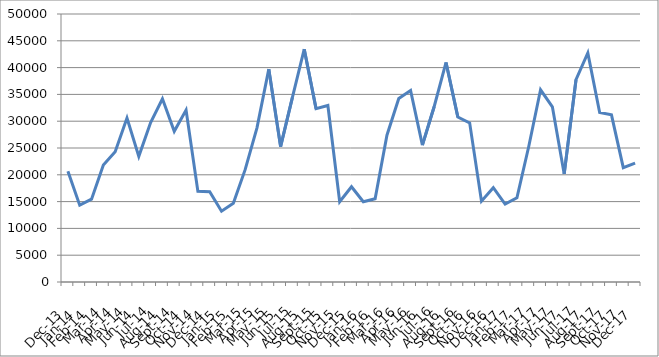
| Category | Mes del Año |
|---|---|
| 2013-12-01 | 20678 |
| 2014-01-01 | 14335 |
| 2014-02-01 | 15455 |
| 2014-03-01 | 21841 |
| 2014-04-01 | 24300 |
| 2014-05-01 | 30608 |
| 2014-06-01 | 23439 |
| 2014-07-01 | 29747 |
| 2014-08-01 | 34195 |
| 2014-09-01 | 28107 |
| 2014-10-01 | 32080 |
| 2014-11-01 | 16911 |
| 2014-12-01 | 16842 |
| 2015-01-01 | 13216 |
| 2015-02-01 | 14678 |
| 2015-03-01 | 20964 |
| 2015-04-01 | 28764 |
| 2015-05-01 | 39712 |
| 2015-06-01 | 25254 |
| 2015-07-01 | 34430 |
| 2015-08-01 | 43428 |
| 2015-09-01 | 32352 |
| 2015-10-01 | 32938 |
| 2015-11-01 | 14992 |
| 2015-12-01 | 17779 |
| 2016-01-01 | 14974 |
| 2016-02-01 | 15526 |
| 2016-03-01 | 27389 |
| 2016-04-01 | 34231 |
| 2016-05-01 | 35728 |
| 2016-06-01 | 25531 |
| 2016-07-01 | 32747 |
| 2016-08-01 | 40962 |
| 2016-09-01 | 30770 |
| 2016-10-01 | 29684 |
| 2016-11-01 | 15081 |
| 2016-12-01 | 17590 |
| 2017-01-01 | 14545 |
| 2017-02-01 | 15699 |
| 2017-03-01 | 25285 |
| 2017-04-01 | 35858 |
| 2017-05-01 | 32692 |
| 2017-06-01 | 20164 |
| 2017-07-01 | 37735 |
| 2017-08-01 | 42726 |
| 2017-09-01 | 31628 |
| 2017-10-01 | 31193 |
| 2017-11-01 | 21341 |
| 2017-12-01 | 22190 |